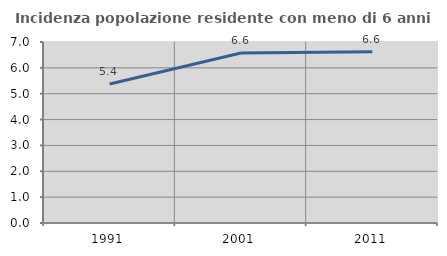
| Category | Incidenza popolazione residente con meno di 6 anni |
|---|---|
| 1991.0 | 5.376 |
| 2001.0 | 6.573 |
| 2011.0 | 6.62 |